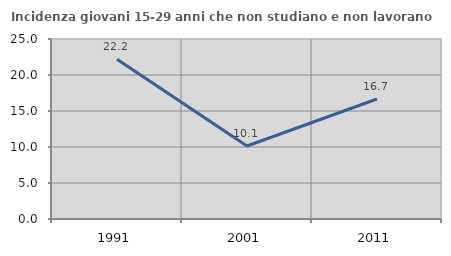
| Category | Incidenza giovani 15-29 anni che non studiano e non lavorano  |
|---|---|
| 1991.0 | 22.198 |
| 2001.0 | 10.141 |
| 2011.0 | 16.667 |